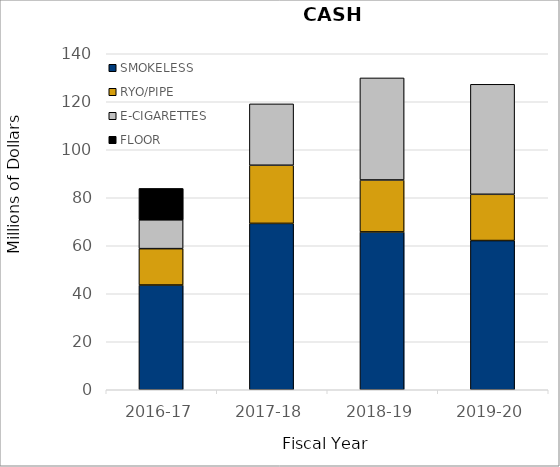
| Category | SMOKELESS | RYO/PIPE | E-CIGARETTES | FLOOR |
|---|---|---|---|---|
| 2016-17 | 43.631 | 15.171 | 12 | 13.1 |
| 2017-18 | 69.321 | 24.226 | 25.573 | 0 |
| 2018-19 | 65.756 | 21.649 | 42.525 | 0 |
| 2019-20 | 62.17 | 19.269 | 45.835 | 0 |